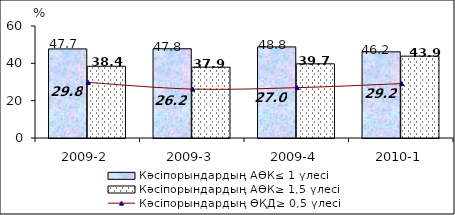
| Category | Кәсіпорындардың АӨК≤ 1 үлесі | Кәсіпорындардың АӨК≥ 1,5 үлесі |
|---|---|---|
| 2009-2 | 47.722 | 38.426 |
| 2009-3 | 47.811 | 37.935 |
| 2009-4 | 48.803 | 39.749 |
| 2010-1 | 46.171 | 43.856 |